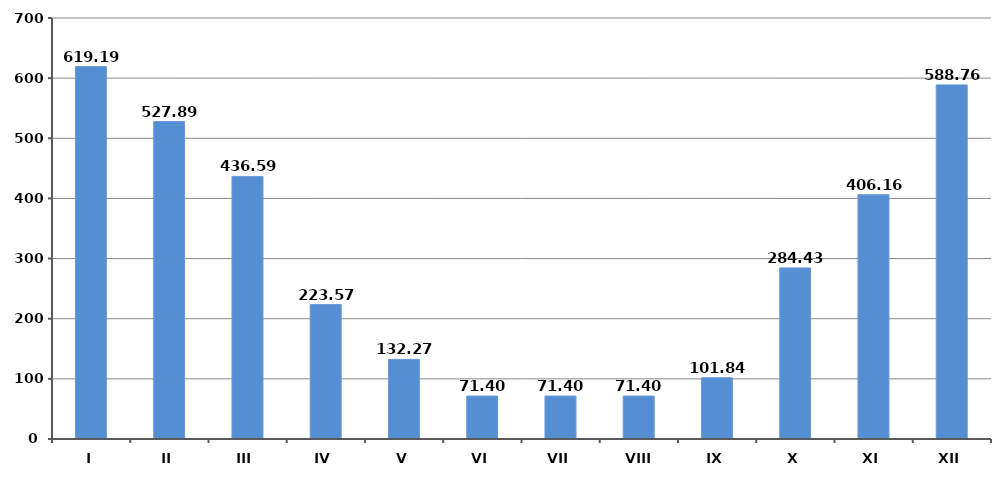
| Category | Series 0 |
|---|---|
| I | 619.189 |
| II | 527.891 |
| III | 436.594 |
| IV | 223.566 |
| V | 132.269 |
| VI | 71.404 |
| VII | 71.404 |
| VIII | 71.404 |
| IX | 101.836 |
| X | 284.431 |
| XI | 406.161 |
| XII | 588.756 |